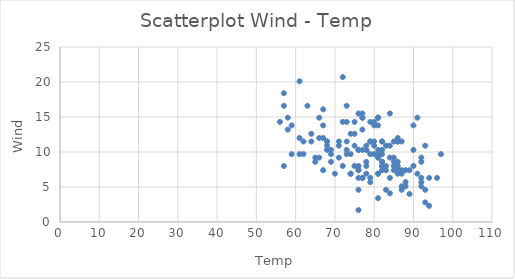
| Category | Wind |
|---|---|
| 41.0 | 7.4 |
| 36.0 | 8 |
| 12.0 | 12.6 |
| 18.0 | 11.5 |
| 24.0 | 14.3 |
| 28.0 | 14.9 |
| 23.0 | 8.6 |
| 19.0 | 13.8 |
| 8.0 | 20.1 |
| 24.0 | 8.6 |
| 7.0 | 6.9 |
| 16.0 | 9.7 |
| 11.0 | 9.2 |
| 14.0 | 10.9 |
| 18.0 | 13.2 |
| 14.0 | 11.5 |
| 34.0 | 12 |
| 6.0 | 18.4 |
| 30.0 | 11.5 |
| 11.0 | 9.7 |
| 1.0 | 9.7 |
| 11.0 | 16.6 |
| 4.0 | 9.7 |
| 32.0 | 12 |
| 24.0 | 16.6 |
| 24.0 | 14.9 |
| 24.0 | 8 |
| 23.0 | 12 |
| 45.0 | 14.9 |
| 115.0 | 5.7 |
| 37.0 | 7.4 |
| 29.0 | 8.6 |
| 29.0 | 9.7 |
| 29.0 | 16.1 |
| 29.0 | 9.2 |
| 29.0 | 8.6 |
| 29.0 | 14.3 |
| 29.0 | 9.7 |
| 29.0 | 6.9 |
| 71.0 | 13.8 |
| 39.0 | 11.5 |
| 29.0 | 10.9 |
| 29.0 | 9.2 |
| 23.0 | 8 |
| 29.0 | 13.8 |
| 29.0 | 11.5 |
| 21.0 | 14.9 |
| 37.0 | 20.7 |
| 20.0 | 9.2 |
| 12.0 | 11.5 |
| 13.0 | 10.3 |
| 29.0 | 6.3 |
| 29.0 | 1.7 |
| 29.0 | 4.6 |
| 29.0 | 6.3 |
| 29.0 | 8 |
| 29.0 | 8 |
| 29.0 | 10.3 |
| 29.0 | 11.5 |
| 29.0 | 14.9 |
| 29.0 | 8 |
| 135.0 | 4.1 |
| 49.0 | 9.2 |
| 32.0 | 9.2 |
| 59.0 | 10.9 |
| 64.0 | 4.6 |
| 40.0 | 10.9 |
| 77.0 | 5.1 |
| 97.0 | 6.3 |
| 97.0 | 5.7 |
| 85.0 | 7.4 |
| 59.0 | 8.6 |
| 10.0 | 14.3 |
| 27.0 | 14.9 |
| 59.0 | 14.9 |
| 7.0 | 14.3 |
| 48.0 | 6.9 |
| 35.0 | 10.3 |
| 61.0 | 6.3 |
| 79.0 | 5.1 |
| 63.0 | 11.5 |
| 16.0 | 6.9 |
| 59.0 | 9.7 |
| 59.0 | 11.5 |
| 80.0 | 8.6 |
| 108.0 | 8 |
| 20.0 | 8.6 |
| 52.0 | 12 |
| 82.0 | 7.4 |
| 50.0 | 7.4 |
| 64.0 | 7.4 |
| 59.0 | 9.2 |
| 39.0 | 6.9 |
| 9.0 | 13.8 |
| 16.0 | 7.4 |
| 78.0 | 6.9 |
| 35.0 | 7.4 |
| 66.0 | 4.6 |
| 122.0 | 4 |
| 89.0 | 10.3 |
| 110.0 | 8 |
| 60.0 | 8.6 |
| 60.0 | 11.5 |
| 44.0 | 11.5 |
| 28.0 | 11.5 |
| 65.0 | 9.7 |
| 60.0 | 11.5 |
| 22.0 | 10.3 |
| 59.0 | 6.3 |
| 23.0 | 7.4 |
| 31.0 | 10.9 |
| 44.0 | 10.3 |
| 21.0 | 15.5 |
| 9.0 | 14.3 |
| 60.0 | 12.6 |
| 45.0 | 9.7 |
| 168.0 | 3.4 |
| 73.0 | 8 |
| 60.0 | 5.7 |
| 76.0 | 9.7 |
| 118.0 | 2.3 |
| 84.0 | 6.3 |
| 85.0 | 6.3 |
| 96.0 | 6.9 |
| 78.0 | 5.1 |
| 73.0 | 2.8 |
| 91.0 | 4.6 |
| 47.0 | 7.4 |
| 32.0 | 15.5 |
| 20.0 | 10.9 |
| 23.0 | 10.3 |
| 21.0 | 10.9 |
| 24.0 | 9.7 |
| 44.0 | 14.9 |
| 21.0 | 15.5 |
| 28.0 | 6.3 |
| 9.0 | 10.9 |
| 13.0 | 11.5 |
| 46.0 | 6.9 |
| 18.0 | 13.8 |
| 13.0 | 10.3 |
| 24.0 | 10.3 |
| 16.0 | 8 |
| 13.0 | 12.6 |
| 23.0 | 9.2 |
| 36.0 | 10.3 |
| 7.0 | 10.3 |
| 14.0 | 16.6 |
| 30.0 | 6.9 |
| 31.0 | 13.2 |
| 14.0 | 14.3 |
| 18.0 | 8 |
| 20.0 | 11.5 |